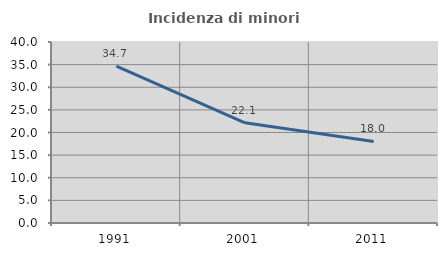
| Category | Incidenza di minori stranieri |
|---|---|
| 1991.0 | 34.694 |
| 2001.0 | 22.143 |
| 2011.0 | 18.028 |